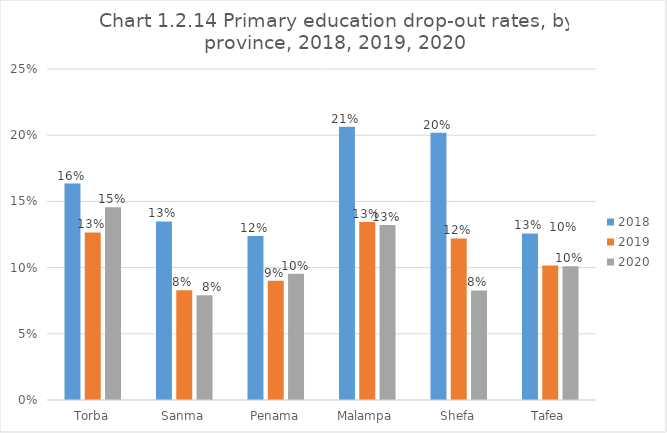
| Category | 2018 | 2019 | 2020 |
|---|---|---|---|
| Torba | 0.163 | 0.127 | 0.146 |
| Sanma | 0.135 | 0.083 | 0.079 |
| Penama | 0.124 | 0.09 | 0.095 |
| Malampa | 0.206 | 0.135 | 0.132 |
| Shefa | 0.202 | 0.122 | 0.083 |
| Tafea | 0.126 | 0.102 | 0.101 |